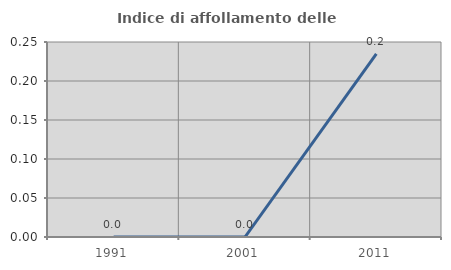
| Category | Indice di affollamento delle abitazioni  |
|---|---|
| 1991.0 | 0 |
| 2001.0 | 0 |
| 2011.0 | 0.235 |